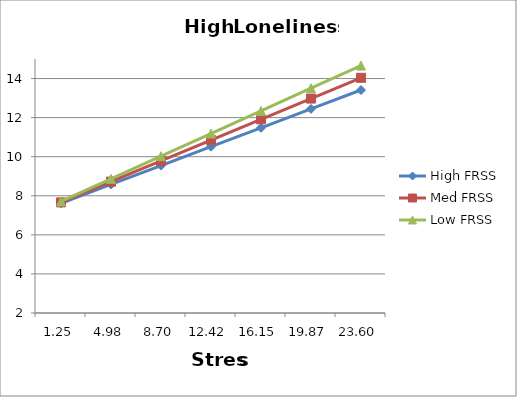
| Category | High FRSS | Med FRSS | Low FRSS |
|---|---|---|---|
| 1.251999999999999 | 7.612 | 7.661 | 7.709 |
| 4.975999999999999 | 8.579 | 8.724 | 8.868 |
| 8.7 | 9.545 | 9.786 | 10.027 |
| 12.424 | 10.512 | 10.849 | 11.186 |
| 16.148 | 11.479 | 11.912 | 12.345 |
| 19.872 | 12.445 | 12.975 | 13.504 |
| 23.596 | 13.412 | 14.037 | 14.663 |